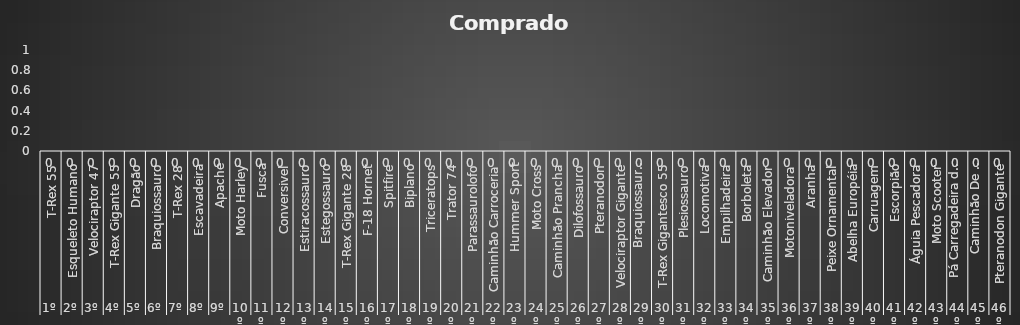
| Category | Comprados |
|---|---|
| 0 | 0 |
| 1 | 0 |
| 2 | 0 |
| 3 | 0 |
| 4 | 0 |
| 5 | 0 |
| 6 | 0 |
| 7 | 0 |
| 8 | 0 |
| 9 | 0 |
| 10 | 0 |
| 11 | 0 |
| 12 | 0 |
| 13 | 0 |
| 14 | 0 |
| 15 | 0 |
| 16 | 0 |
| 17 | 0 |
| 18 | 0 |
| 19 | 0 |
| 20 | 0 |
| 21 | 0 |
| 22 | 0 |
| 23 | 0 |
| 24 | 0 |
| 25 | 0 |
| 26 | 0 |
| 27 | 0 |
| 28 | 0 |
| 29 | 0 |
| 30 | 0 |
| 31 | 0 |
| 32 | 0 |
| 33 | 0 |
| 34 | 0 |
| 35 | 0 |
| 36 | 0 |
| 37 | 0 |
| 38 | 0 |
| 39 | 0 |
| 40 | 0 |
| 41 | 0 |
| 42 | 0 |
| 43 | 0 |
| 44 | 0 |
| 45 | 0 |